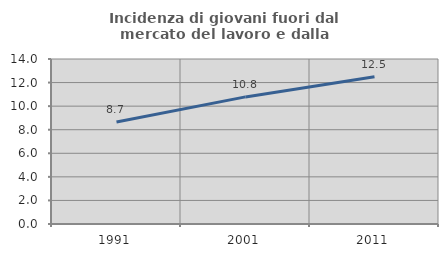
| Category | Incidenza di giovani fuori dal mercato del lavoro e dalla formazione  |
|---|---|
| 1991.0 | 8.655 |
| 2001.0 | 10.784 |
| 2011.0 | 12.5 |